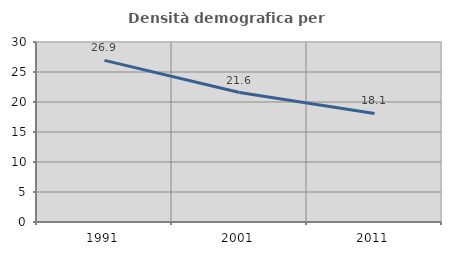
| Category | Densità demografica |
|---|---|
| 1991.0 | 26.942 |
| 2001.0 | 21.578 |
| 2011.0 | 18.095 |